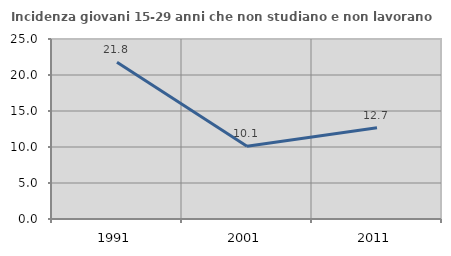
| Category | Incidenza giovani 15-29 anni che non studiano e non lavorano  |
|---|---|
| 1991.0 | 21.777 |
| 2001.0 | 10.105 |
| 2011.0 | 12.664 |